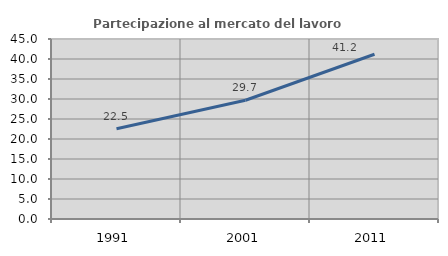
| Category | Partecipazione al mercato del lavoro  femminile |
|---|---|
| 1991.0 | 22.549 |
| 2001.0 | 29.688 |
| 2011.0 | 41.19 |